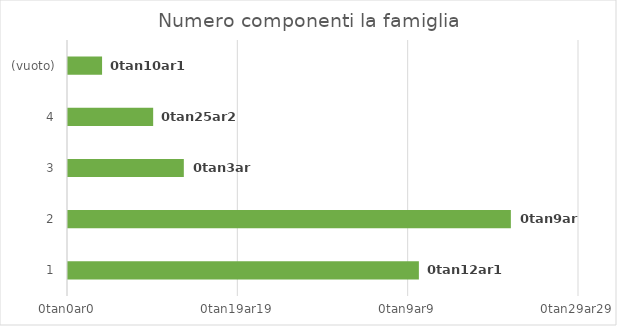
| Category | Totale |
|---|---|
| 1 | 103 |
| 2 | 130 |
| 3 | 34 |
| 4 | 25 |
| (vuoto) | 10 |